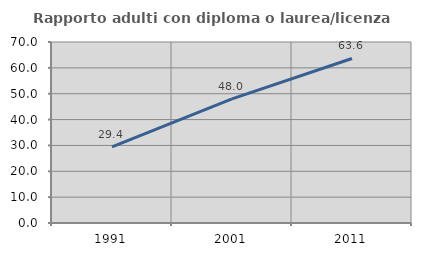
| Category | Rapporto adulti con diploma o laurea/licenza media  |
|---|---|
| 1991.0 | 29.412 |
| 2001.0 | 48 |
| 2011.0 | 63.636 |